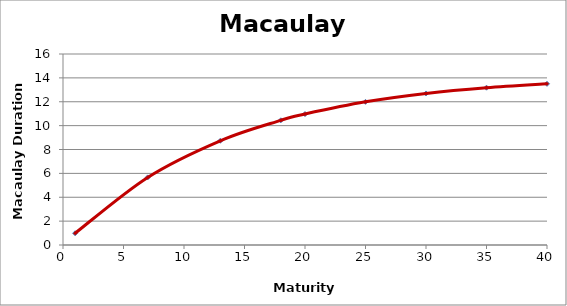
| Category | Series 0 |
|---|---|
| 1.0 | 0.984 |
| 7.0 | 5.663 |
| 13.0 | 8.732 |
| 18.0 | 10.445 |
| 20.0 | 10.973 |
| 25.0 | 11.993 |
| 30.0 | 12.694 |
| 35.0 | 13.175 |
| 40.0 | 13.503 |